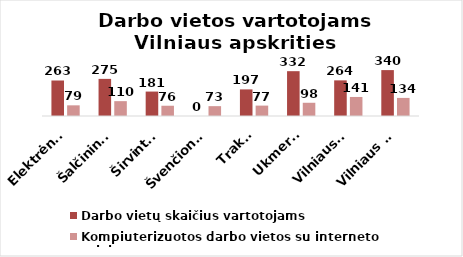
| Category | Darbo vietų skaičius vartotojams | Kompiuterizuotos darbo vietos su interneto prieiga |
|---|---|---|
| Elektrėnai | 263 | 79 |
| Šalčininkai | 275 | 110 |
| Širvintos | 181 | 76 |
| Švenčionys | 0 | 73 |
| Trakai | 197 | 77 |
| Ukmergė | 332 | 98 |
| Vilniaus r. | 264 | 141 |
| Vilniaus m. | 340 | 134 |